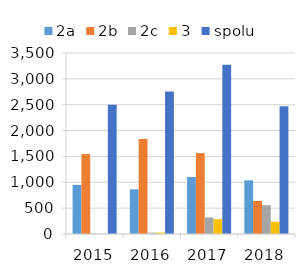
| Category | 2a | 2b | 2c | 3 | spolu |
|---|---|---|---|---|---|
| 2015.0 | 950 | 1545 | 6 | 0 | 2501 |
| 2016.0 | 863 | 1839 | 27 | 27 | 2756 |
| 2017.0 | 1103 | 1565 | 320 | 287 | 3275 |
| 2018.0 | 1037 | 639 | 556 | 238 | 2470 |